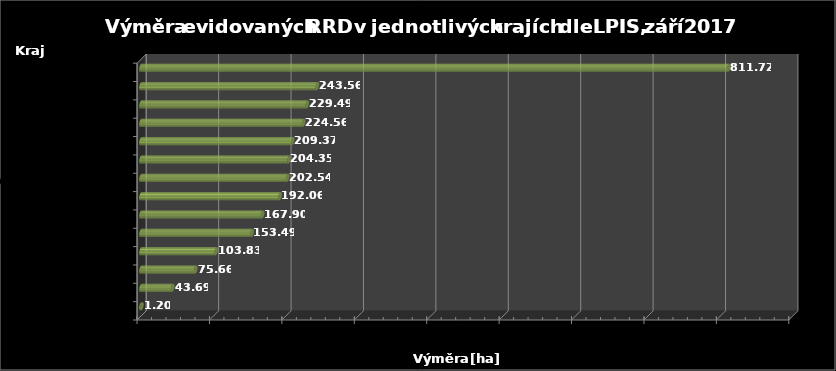
| Category | Výměra [ha] |
|---|---|
| Praha | 1.2 |
| Karlovarský | 43.69 |
| Zlínský | 75.66 |
| Liberecký | 103.83 |
| Pardubický | 153.49 |
| Olomoucký | 167.9 |
| Moravskoslezský | 192.06 |
| Královéhradecký | 202.54 |
| Jihomoravský | 204.35 |
| Ústecký | 209.37 |
| Jihočeský | 224.56 |
| Středočeský | 229.49 |
| Vysočina | 243.56 |
| Plzeňský | 811.72 |